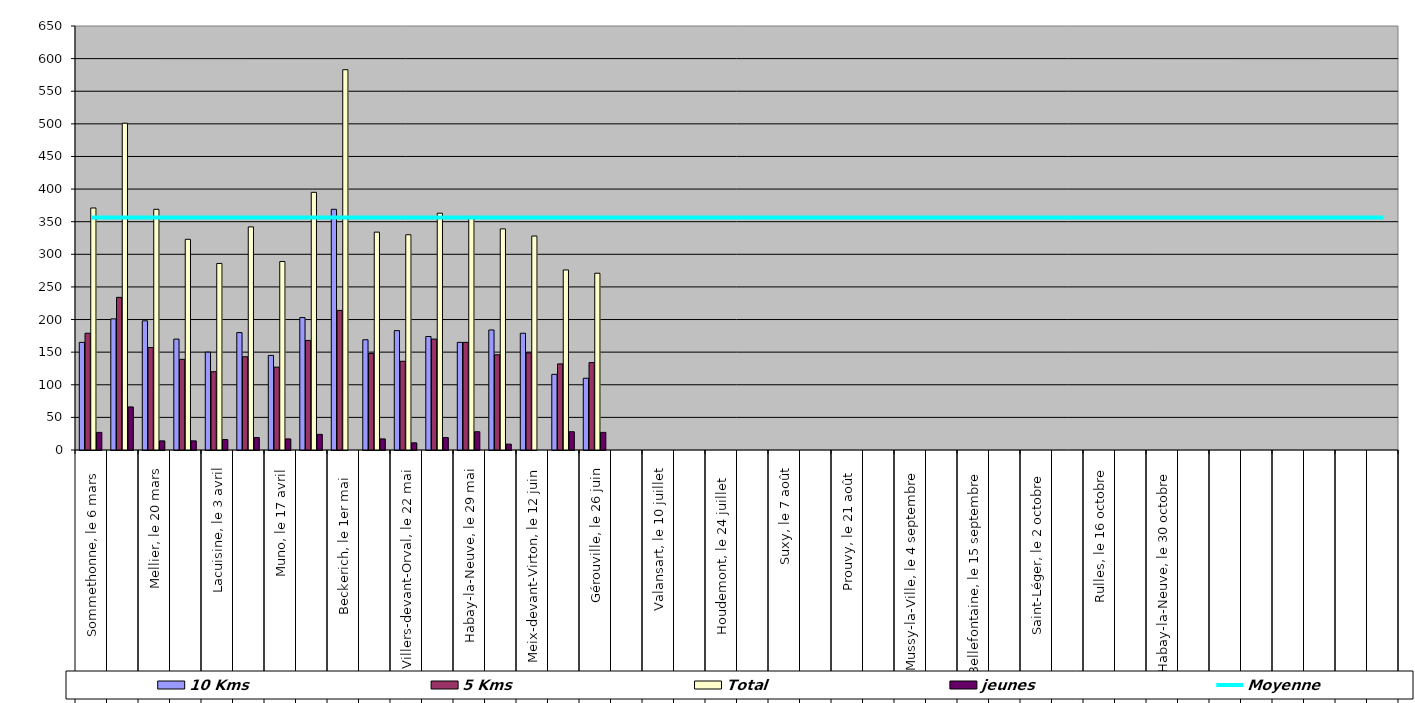
| Category | 10 Kms | 5 Kms | Total | jeunes |
|---|---|---|---|---|
| 0 | 165 | 179 | 371 | 27 |
| 1 | 201 | 234 | 501 | 66 |
| 2 | 198 | 157 | 369 | 14 |
| 3 | 170 | 139 | 323 | 14 |
| 4 | 150 | 120 | 286 | 16 |
| 5 | 180 | 143 | 342 | 19 |
| 6 | 145 | 127 | 289 | 17 |
| 7 | 203 | 168 | 395 | 24 |
| 8 | 369 | 214 | 583 | 0 |
| 9 | 169 | 148 | 334 | 17 |
| 10 | 183 | 136 | 330 | 11 |
| 11 | 174 | 170 | 363 | 19 |
| 12 | 165 | 165 | 358 | 28 |
| 13 | 184 | 146 | 339 | 9 |
| 14 | 179 | 149 | 328 | 0 |
| 15 | 116 | 132 | 276 | 28 |
| 16 | 110 | 134 | 271 | 27 |
| 17 | 0 | 0 | 0 | 0 |
| 18 | 0 | 0 | 0 | 0 |
| 19 | 0 | 0 | 0 | 0 |
| 20 | 0 | 0 | 0 | 0 |
| 21 | 0 | 0 | 0 | 0 |
| 22 | 0 | 0 | 0 | 0 |
| 23 | 0 | 0 | 0 | 0 |
| 24 | 0 | 0 | 0 | 0 |
| 25 | 0 | 0 | 0 | 0 |
| 26 | 0 | 0 | 0 | 0 |
| 27 | 0 | 0 | 0 | 0 |
| 28 | 0 | 0 | 0 | 0 |
| 29 | 0 | 0 | 0 | 0 |
| 30 | 0 | 0 | 0 | 0 |
| 31 | 0 | 0 | 0 | 0 |
| 32 | 0 | 0 | 0 | 0 |
| 33 | 0 | 0 | 0 | 0 |
| 34 | 0 | 0 | 0 | 0 |
| 35 | 0 | 0 | 0 | 0 |
| 36 | 0 | 0 | 0 | 0 |
| 37 | 0 | 0 | 0 | 0 |
| 38 | 0 | 0 | 0 | 0 |
| 39 | 0 | 0 | 0 | 0 |
| 40 | 0 | 0 | 0 | 0 |
| 41 | 0 | 0 | 0 | 0 |